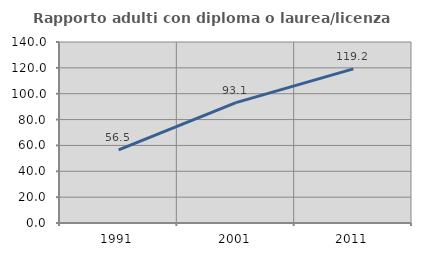
| Category | Rapporto adulti con diploma o laurea/licenza media  |
|---|---|
| 1991.0 | 56.548 |
| 2001.0 | 93.139 |
| 2011.0 | 119.244 |